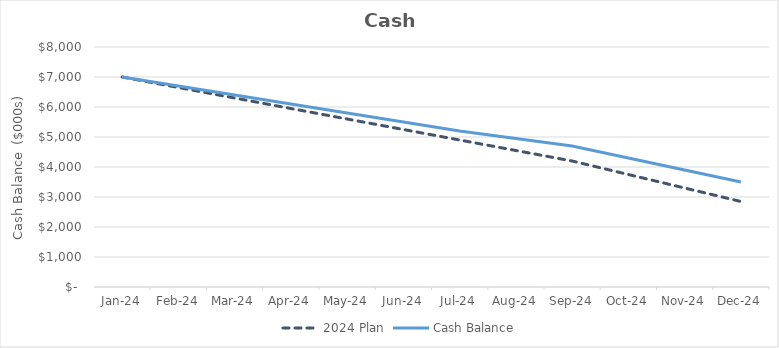
| Category | 2024 Plan | Cash Balance |
|---|---|---|
| 2024-01-31 | 7000 | 7000 |
| 2024-02-29 | 6650 | 6700 |
| 2024-03-31 | 6300 | 6400 |
| 2024-04-30 | 5950 | 6100 |
| 2024-05-31 | 5600 | 5800 |
| 2024-06-30 | 5250 | 5500 |
| 2024-07-31 | 4900 | 5200 |
| 2024-08-31 | 4550 | 4950 |
| 2024-09-30 | 4200 | 4700 |
| 2024-10-31 | 3750 | 4300 |
| 2024-11-30 | 3300 | 3900 |
| 2024-12-31 | 2850 | 3500 |